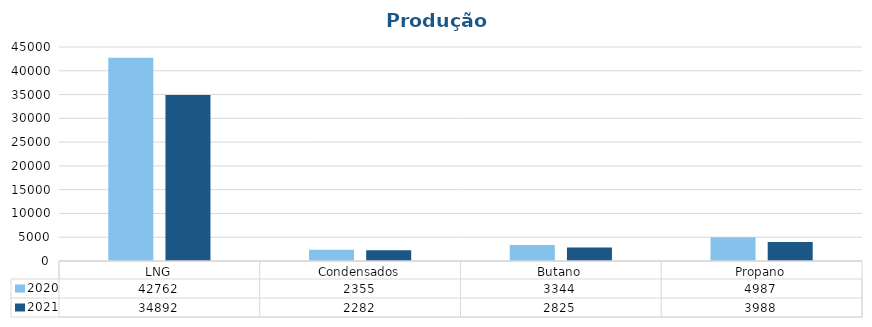
| Category | 2020 | 2021 |
|---|---|---|
| LNG | 42762 | 34892 |
| Condensados | 2355 | 2282 |
| Butano | 3344 | 2825 |
| Propano | 4987 | 3988 |